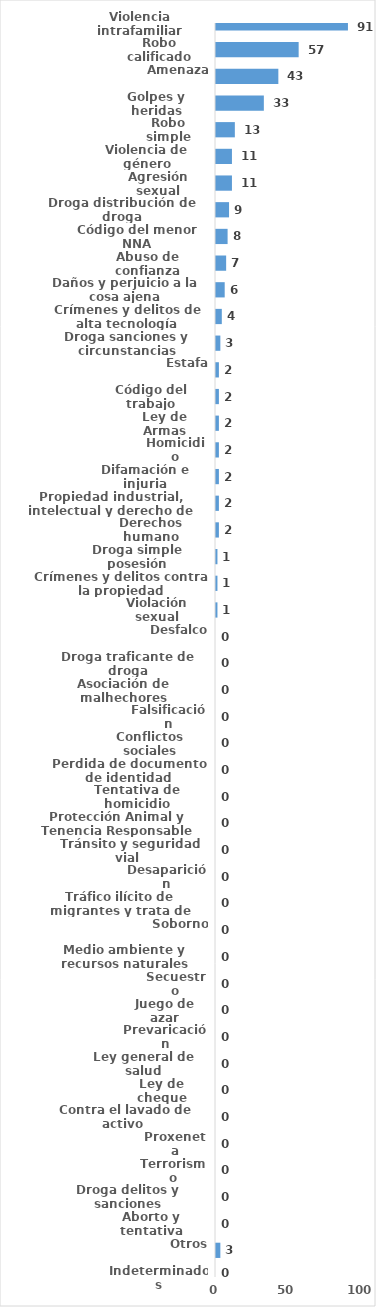
| Category | Series 0 |
|---|---|
| Violencia intrafamiliar | 91 |
| Robo calificado | 57 |
| Amenaza | 43 |
| Golpes y heridas | 33 |
| Robo simple | 13 |
| Violencia de género | 11 |
| Agresión sexual | 11 |
| Droga distribución de droga | 9 |
| Código del menor NNA | 8 |
| Abuso de confianza | 7 |
| Daños y perjuicio a la cosa ajena | 6 |
| Crímenes y delitos de alta tecnología | 4 |
| Droga sanciones y circunstancias agravantes | 3 |
| Estafa | 2 |
| Código del trabajo | 2 |
| Ley de Armas | 2 |
| Homicidio | 2 |
| Difamación e injuria | 2 |
| Propiedad industrial, intelectual y derecho de autor | 2 |
| Derechos humano | 2 |
| Droga simple posesión | 1 |
| Crímenes y delitos contra la propiedad | 1 |
| Violación sexual | 1 |
| Desfalco | 0 |
| Droga traficante de droga | 0 |
| Asociación de malhechores | 0 |
| Falsificación | 0 |
| Conflictos sociales | 0 |
| Perdida de documento de identidad | 0 |
| Tentativa de homicidio | 0 |
| Protección Animal y Tenencia Responsable | 0 |
| Tránsito y seguridad vial  | 0 |
| Desaparición | 0 |
| Tráfico ilícito de migrantes y trata de personas | 0 |
| Soborno | 0 |
| Medio ambiente y recursos naturales | 0 |
| Secuestro | 0 |
| Juego de azar | 0 |
| Prevaricación | 0 |
| Ley general de salud | 0 |
| Ley de cheque | 0 |
| Contra el lavado de activo  | 0 |
| Proxeneta | 0 |
| Terrorismo | 0 |
| Droga delitos y sanciones | 0 |
| Aborto y tentativa | 0 |
| Otros | 3 |
| Indeterminados | 0 |